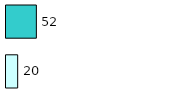
| Category | Series 0 | Series 1 |
|---|---|---|
| 0 | 20 | 52 |